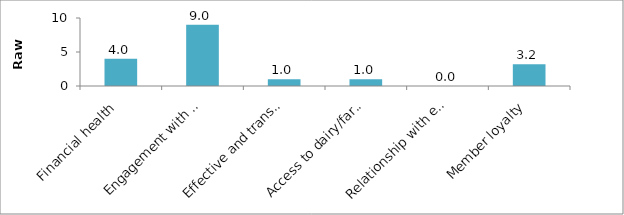
| Category | Series 0 |
|---|---|
| Financial health  | 4 |
| Engagement with output market | 9 |
| Effective and transparent PO leadership and management | 1 |
| Access to dairy/farm inputs and services | 1 |
| Relationship with external environment | 0 |
| Member loyalty | 3.2 |